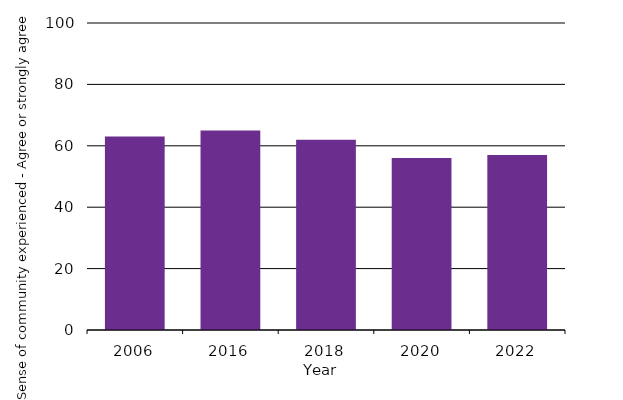
| Category | Sense of community experienced - Agree or strongly agree |
|---|---|
| 2006.0 | 63 |
| 2016.0 | 65 |
| 2018.0 | 62 |
| 2020.0 | 56 |
| 2022.0 | 57 |